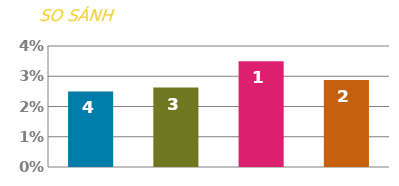
| Category | LÃI SUẤT |
|---|---|
| 0 | 0.025 |
| 1 | 0.026 |
| 2 | 0.035 |
| 3 | 0.029 |